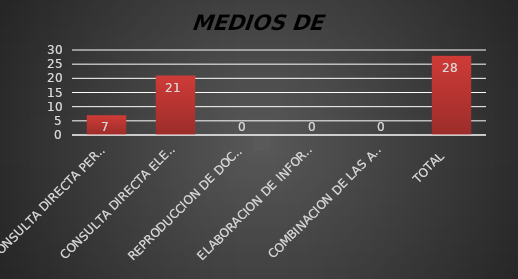
| Category | Series 1 |
|---|---|
| CONSULTA DIRECTA PERSONAL | 7 |
| CONSULTA DIRECTA ELECTRONICA | 21 |
| REPRODUCCION DE DOCUMENTOS  | 0 |
| ELABORACION DE INFORMES ESPECIFICOS  | 0 |
| COMBINACION DE LAS ANTERIORES | 0 |
| TOTAL  | 28 |